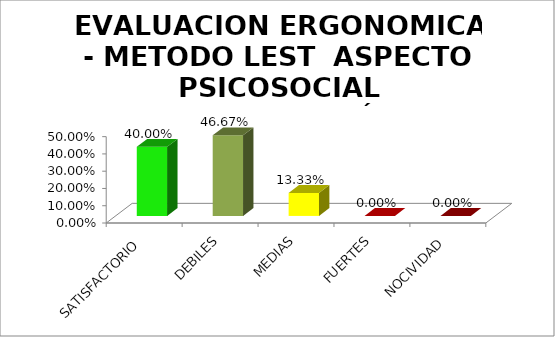
| Category | EVALUACION ERGONOMICA - METODO LEST  |
|---|---|
| SATISFACTORIO | 0.4 |
| DEBILES | 0.467 |
| MEDIAS | 0.133 |
| FUERTES | 0 |
| NOCIVIDAD | 0 |